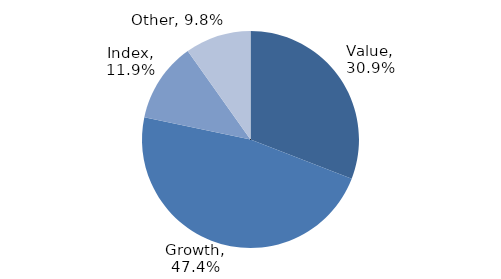
| Category | Investment Style |
|---|---|
| Value | 0.309 |
| Growth | 0.474 |
| Index | 0.119 |
| Other | 0.098 |